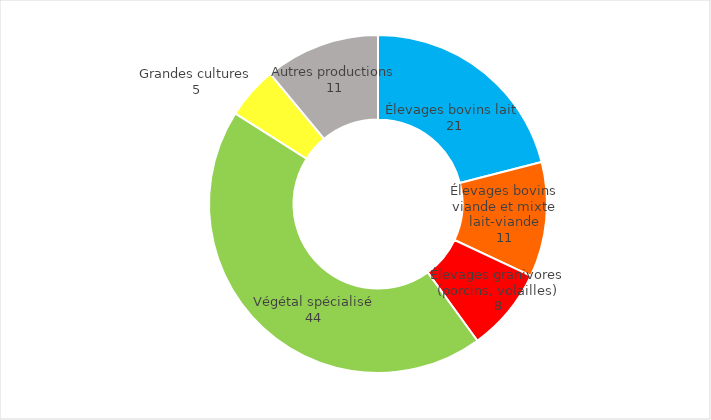
| Category | Series 0 |
|---|---|
| Élevages bovins lait  | 21 |
| Élevages bovins viande et mixte lait-viande | 11 |
| Élevages granivores (porcins, volailles) | 8 |
| Végétal spécialisé | 44 |
| Grandes cultures | 5 |
| Autres productions | 11 |